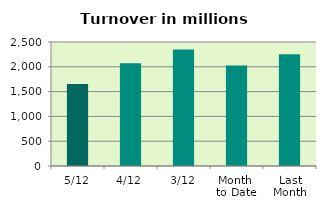
| Category | Series 0 |
|---|---|
| 5/12 | 1654.411 |
| 4/12 | 2069.913 |
| 3/12 | 2351.13 |
| Month 
to Date | 2025.151 |
| Last
Month | 2254.707 |